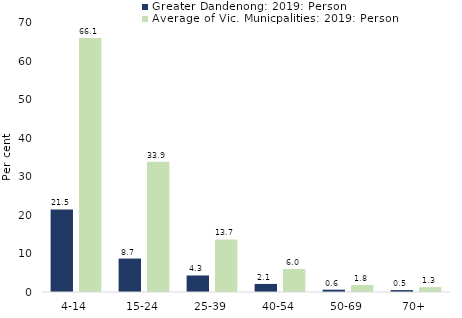
| Category | Greater Dandenong: 2019: Person | Average of Vic. Municpalities: 2019: Person |
|---|---|---|
| 4-14 | 21.5 | 66.109 |
| 15-24 | 8.7 | 33.921 |
| 25-39 | 4.3 | 13.678 |
| 40-54 | 2.1 | 5.999 |
| 50-69 | 0.6 | 1.81 |
| 70+ | 0.5 | 1.259 |